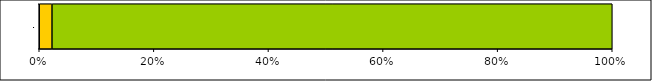
| Category | Series 0 | Series 1 | Series 2 | Series 3 |
|---|---|---|---|---|
| 0 | 0 | 1 | 44 | 0 |